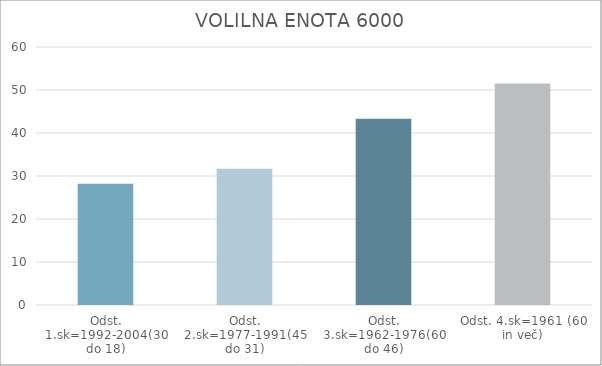
| Category | Series 0 |
|---|---|
| Odst. 1.sk=1992-2004(30 do 18) | 28.2 |
| Odst. 2.sk=1977-1991(45 do 31) | 31.69 |
| Odst. 3.sk=1962-1976(60 do 46) | 43.34 |
| Odst. 4.sk=1961 (60 in več) | 51.53 |